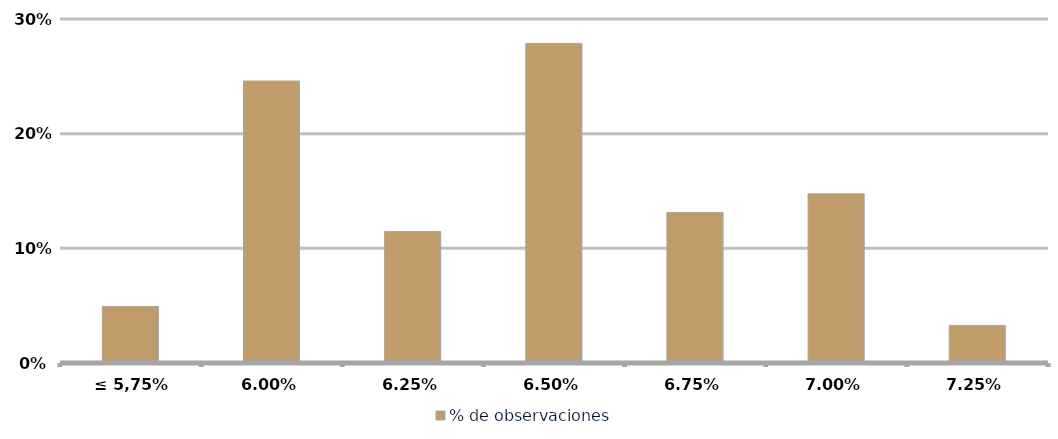
| Category | % de observaciones  |
|---|---|
| ≤ 5,75% | 0.049 |
| 6,00% | 0.246 |
| 6,25% | 0.115 |
| 6,50% | 0.279 |
| 6,75% | 0.131 |
| 7,00% | 0.148 |
| 7,25% | 0.033 |